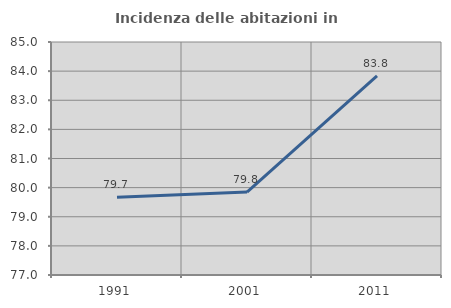
| Category | Incidenza delle abitazioni in proprietà  |
|---|---|
| 1991.0 | 79.672 |
| 2001.0 | 79.846 |
| 2011.0 | 83.836 |